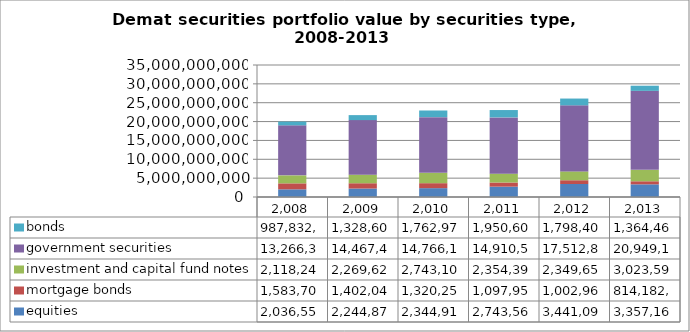
| Category | equities | mortgage bonds | investment and capital fund notes | government securities | bonds |
|---|---|---|---|---|---|
| 2008.0 | 2036556683.939 | 1583700646.76 | 2118249234.376 | 13266351130 | 987832574.947 |
| 2009.0 | 2244874432 | 1402048180 | 2269623795 | 14467402330 | 1328602759 |
| 2010.0 | 2344911567 | 1320255675 | 2743106103 | 14766198820 | 1762978607 |
| 2011.0 | 2743560292.047 | 1097953560 | 2354396370.134 | 14910504960 | 1950606550.931 |
| 2012.0 | 3441094149.807 | 1002966515 | 2349658948.344 | 17512891870 | 1798402468.727 |
| 2013.0 | 3357167890.812 | 814182814 | 3023598482.767 | 20949115825 | 1364468629.657 |